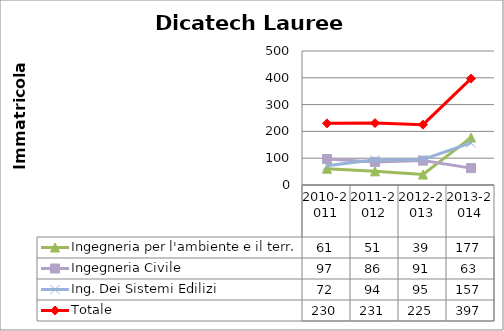
| Category | Ingegneria per l'ambiente e il terr. | Ingegneria Civile | Ing. Dei Sistemi Edilizi | Totale |
|---|---|---|---|---|
| 2010-2011 | 61 | 97 | 72 | 230 |
| 2011-2012 | 51 | 86 | 94 | 231 |
| 2012-2013 | 39 | 91 | 95 | 225 |
| 2013-2014 | 177 | 63 | 157 | 397 |